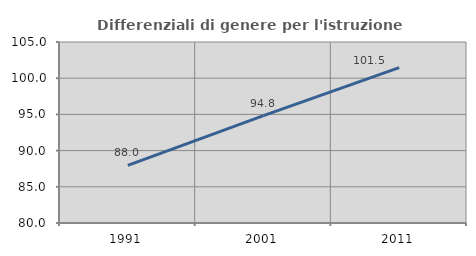
| Category | Differenziali di genere per l'istruzione superiore |
|---|---|
| 1991.0 | 87.964 |
| 2001.0 | 94.842 |
| 2011.0 | 101.471 |